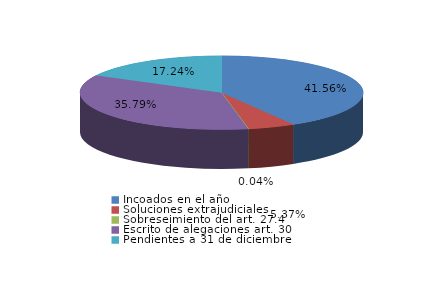
| Category | Series 0 |
|---|---|
| Incoados en el año | 1921 |
| Soluciones extrajudiciales | 248 |
| Sobreseimiento del art. 27.4 | 2 |
| Escrito de alegaciones art. 30 | 1654 |
| Pendientes a 31 de diciembre | 797 |